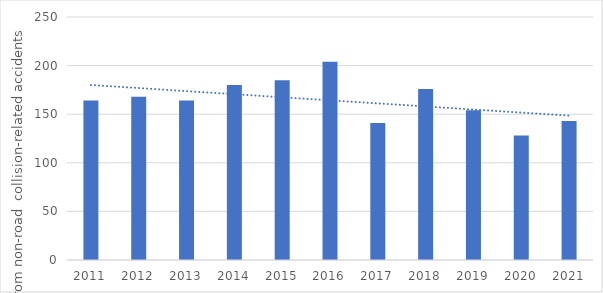
| Category | Total |
|---|---|
| 2011 | 164 |
| 2012 | 168 |
| 2013 | 164 |
| 2014 | 180 |
| 2015 | 185 |
| 2016 | 204 |
| 2017 | 141 |
| 2018 | 176 |
| 2019 | 154 |
| 2020 | 128 |
| 2021 | 143 |